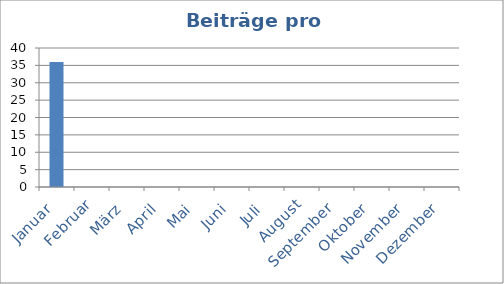
| Category | Beiträge |
|---|---|
| Januar | 36 |
| Februar | 0 |
| März | 0 |
| April | 0 |
| Mai | 0 |
| Juni | 0 |
| Juli | 0 |
| August | 0 |
| September | 0 |
| Oktober | 0 |
| November | 0 |
| Dezember | 0 |